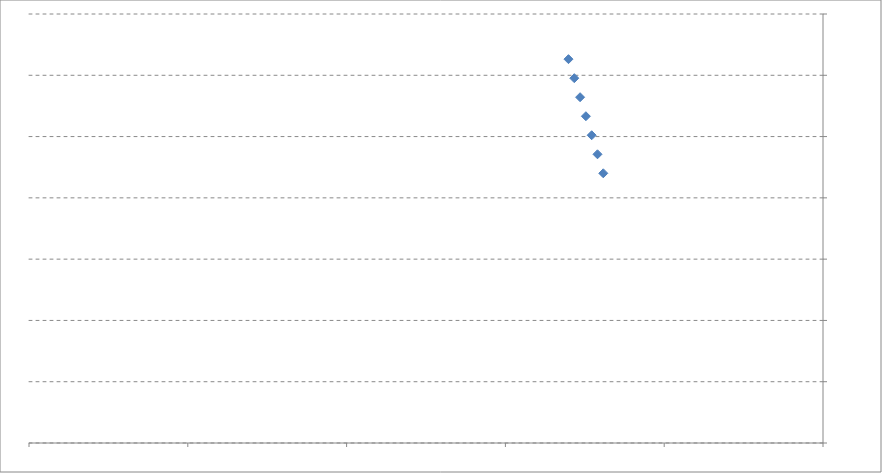
| Category | Series 0 |
|---|---|
| 85.30140206185567 | 36.853 |
| 85.28313402061856 | 36.791 |
| 85.26486597938145 | 36.728 |
| 85.24659793814433 | 36.666 |
| 85.22832989690723 | 36.604 |
| 85.2100618556701 | 36.542 |
| 85.191793814433 | 36.48 |